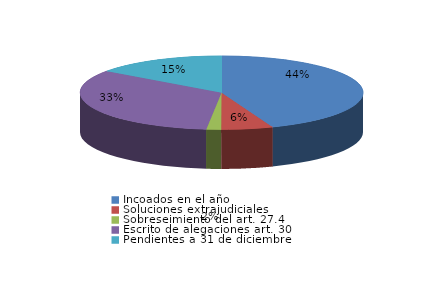
| Category | Series 0 |
|---|---|
| Incoados en el año | 788 |
| Soluciones extrajudiciales | 105 |
| Sobreseimiento del art. 27.4 | 30 |
| Escrito de alegaciones art. 30 | 594 |
| Pendientes a 31 de diciembre | 268 |